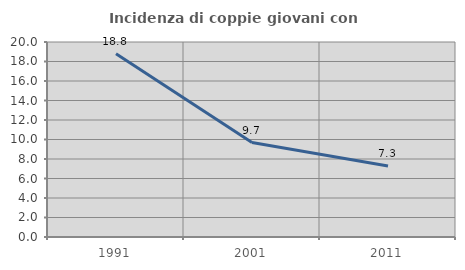
| Category | Incidenza di coppie giovani con figli |
|---|---|
| 1991.0 | 18.786 |
| 2001.0 | 9.689 |
| 2011.0 | 7.286 |